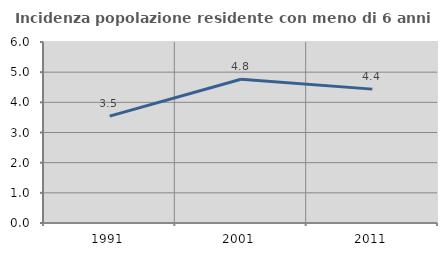
| Category | Incidenza popolazione residente con meno di 6 anni |
|---|---|
| 1991.0 | 3.542 |
| 2001.0 | 4.764 |
| 2011.0 | 4.438 |